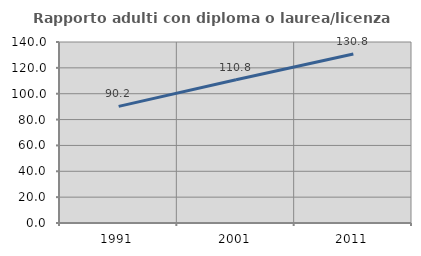
| Category | Rapporto adulti con diploma o laurea/licenza media  |
|---|---|
| 1991.0 | 90.182 |
| 2001.0 | 110.813 |
| 2011.0 | 130.769 |